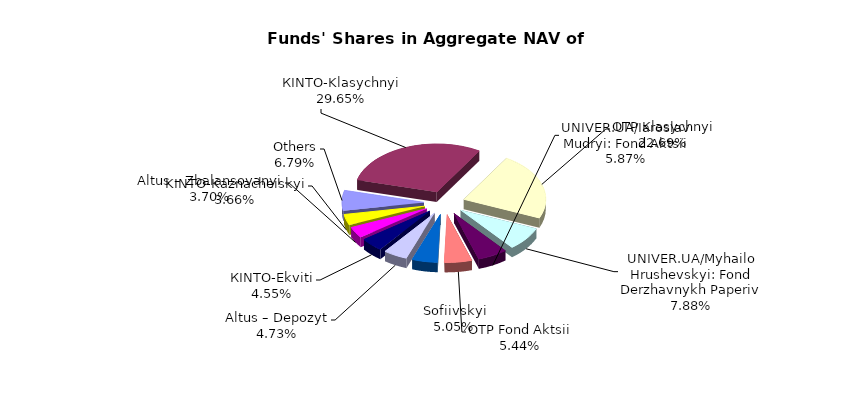
| Category | Series 0 | Series 1 |
|---|---|---|
| Others | 6788232.25 | 0.068 |
| КІNТО-Klasychnyi | 29636540.54 | 0.297 |
| OTP Klasychnyi | 22678417.37 | 0.227 |
| UNIVER.UA/Myhailo Hrushevskyi: Fond Derzhavnykh Paperiv | 7880952.75 | 0.079 |
| UNIVER.UA/Iaroslav Mudryi: Fond Aktsii | 5866031.53 | 0.059 |
| OTP Fond Aktsii | 5432733.78 | 0.054 |
| Sofiivskyi | 5044047.54 | 0.05 |
| Altus – Depozyt | 4732346.2 | 0.047 |
| КІNTO-Ekviti | 4545533.08 | 0.045 |
| Altus – Zbalansovanyi | 3695519.89 | 0.037 |
| KINTO-Kaznacheiskyi | 3654090.17 | 0.037 |